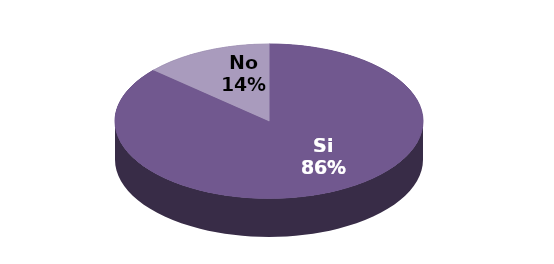
| Category | Series 1 |
|---|---|
| Si | 32 |
| No | 5 |